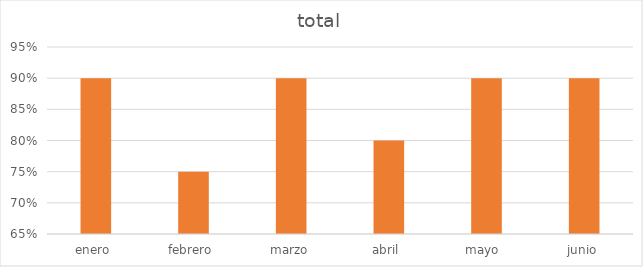
| Category | total |
|---|---|
| enero  | 0.9 |
| febrero  | 0.75 |
| marzo | 0.9 |
| abril  | 0.8 |
| mayo  | 0.9 |
| junio | 0.9 |